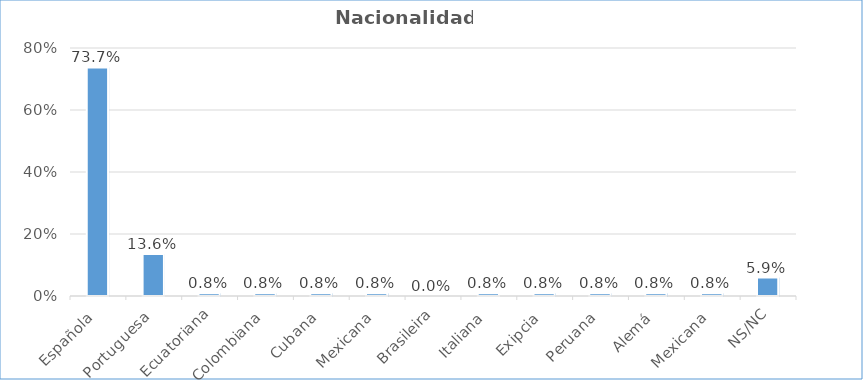
| Category | Nacionalidade |
|---|---|
| Española | 0.737 |
| Portuguesa | 0.136 |
| Ecuatoriana | 0.008 |
| Colombiana | 0.008 |
| Cubana | 0.008 |
| Mexicana | 0.008 |
| Brasileira | 0 |
| Italiana | 0.008 |
| Exipcia | 0.008 |
| Peruana | 0.008 |
| Alemá | 0.008 |
| Mexicana | 0.008 |
| NS/NC | 0.059 |